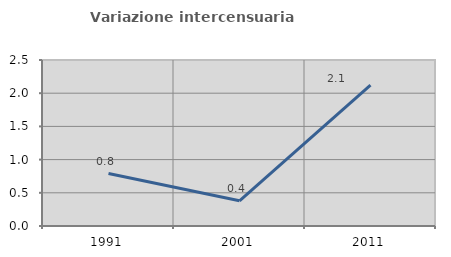
| Category | Variazione intercensuaria annua |
|---|---|
| 1991.0 | 0.79 |
| 2001.0 | 0.379 |
| 2011.0 | 2.121 |